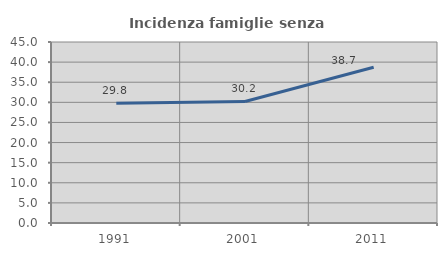
| Category | Incidenza famiglie senza nuclei |
|---|---|
| 1991.0 | 29.787 |
| 2001.0 | 30.208 |
| 2011.0 | 38.737 |